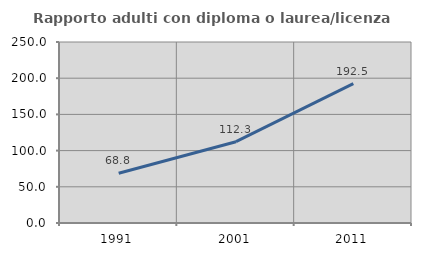
| Category | Rapporto adulti con diploma o laurea/licenza media  |
|---|---|
| 1991.0 | 68.75 |
| 2001.0 | 112.315 |
| 2011.0 | 192.537 |